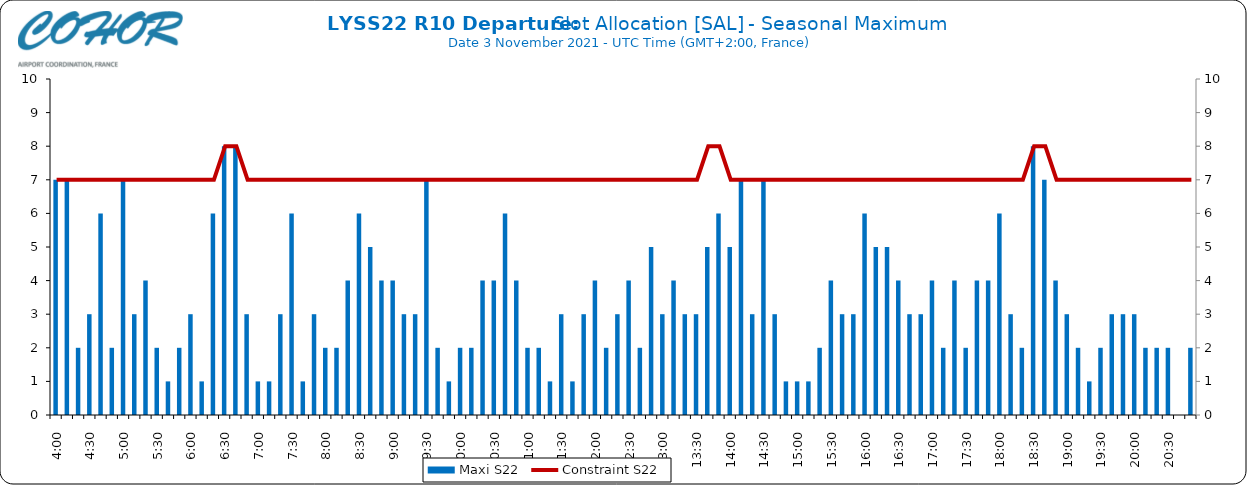
| Category | Maxi S22 |
|---|---|
| 0.16666666666666666 | 7 |
| 0.17361111111111113 | 7 |
| 0.18055555555555555 | 2 |
| 0.1875 | 3 |
| 0.19444444444444445 | 6 |
| 0.20138888888888887 | 2 |
| 0.20833333333333334 | 7 |
| 0.2152777777777778 | 3 |
| 0.2222222222222222 | 4 |
| 0.22916666666666666 | 2 |
| 0.23611111111111113 | 1 |
| 0.24305555555555555 | 2 |
| 0.25 | 3 |
| 0.2569444444444445 | 1 |
| 0.2638888888888889 | 6 |
| 0.2708333333333333 | 8 |
| 0.2777777777777778 | 8 |
| 0.2847222222222222 | 3 |
| 0.2916666666666667 | 1 |
| 0.2986111111111111 | 1 |
| 0.3055555555555555 | 3 |
| 0.3125 | 6 |
| 0.3194444444444445 | 1 |
| 0.3263888888888889 | 3 |
| 0.3333333333333333 | 2 |
| 0.34027777777777773 | 2 |
| 0.34722222222222227 | 4 |
| 0.3541666666666667 | 6 |
| 0.3611111111111111 | 5 |
| 0.3680555555555556 | 4 |
| 0.375 | 4 |
| 0.3819444444444444 | 3 |
| 0.3888888888888889 | 3 |
| 0.3958333333333333 | 7 |
| 0.40277777777777773 | 2 |
| 0.40972222222222227 | 1 |
| 0.4166666666666667 | 2 |
| 0.4236111111111111 | 2 |
| 0.4305555555555556 | 4 |
| 0.4375 | 4 |
| 0.4444444444444444 | 6 |
| 0.4513888888888889 | 4 |
| 0.4583333333333333 | 2 |
| 0.46527777777777773 | 2 |
| 0.47222222222222227 | 1 |
| 0.4791666666666667 | 3 |
| 0.4861111111111111 | 1 |
| 0.4930555555555556 | 3 |
| 0.5 | 4 |
| 0.5069444444444444 | 2 |
| 0.513888888888889 | 3 |
| 0.5208333333333334 | 4 |
| 0.5277777777777778 | 2 |
| 0.5347222222222222 | 5 |
| 0.5416666666666666 | 3 |
| 0.548611111111111 | 4 |
| 0.5555555555555556 | 3 |
| 0.5625 | 3 |
| 0.5694444444444444 | 5 |
| 0.576388888888889 | 6 |
| 0.5833333333333334 | 5 |
| 0.5902777777777778 | 7 |
| 0.5972222222222222 | 3 |
| 0.6041666666666666 | 7 |
| 0.611111111111111 | 3 |
| 0.6180555555555556 | 1 |
| 0.625 | 1 |
| 0.6319444444444444 | 1 |
| 0.638888888888889 | 2 |
| 0.6458333333333334 | 4 |
| 0.6527777777777778 | 3 |
| 0.6597222222222222 | 3 |
| 0.6666666666666666 | 6 |
| 0.6736111111111112 | 5 |
| 0.6805555555555555 | 5 |
| 0.6875 | 4 |
| 0.6944444444444445 | 3 |
| 0.7013888888888888 | 3 |
| 0.7083333333333334 | 4 |
| 0.7152777777777778 | 2 |
| 0.7222222222222222 | 4 |
| 0.7291666666666666 | 2 |
| 0.7361111111111112 | 4 |
| 0.7430555555555555 | 4 |
| 0.75 | 6 |
| 0.7569444444444445 | 3 |
| 0.7638888888888888 | 2 |
| 0.7708333333333334 | 8 |
| 0.7777777777777778 | 7 |
| 0.7847222222222222 | 4 |
| 0.7916666666666666 | 3 |
| 0.7986111111111112 | 2 |
| 0.8055555555555555 | 1 |
| 0.8125 | 2 |
| 0.8194444444444445 | 3 |
| 0.8263888888888888 | 3 |
| 0.8333333333333334 | 3 |
| 0.8402777777777778 | 2 |
| 0.8472222222222222 | 2 |
| 0.8541666666666666 | 2 |
| 0.8611111111111112 | 0 |
| 0.8680555555555555 | 2 |